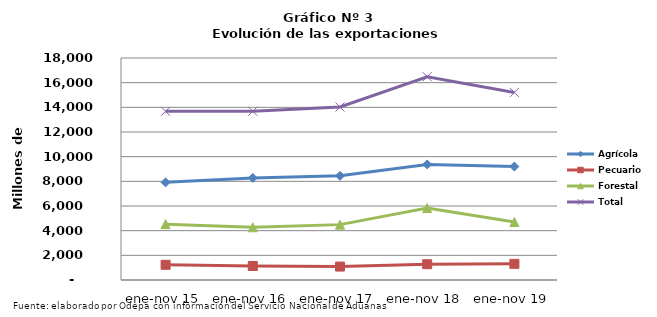
| Category | Agrícola | Pecuario | Forestal | Total |
|---|---|---|---|---|
| ene-nov 15 | 7916350 | 1233633 | 4528541 | 13678524 |
| ene-nov 16 | 8274279 | 1135833 | 4274966 | 13685078 |
| ene-nov 17 | 8448657 | 1088304 | 4489789 | 14026750 |
| ene-nov 18 | 9370749 | 1280199 | 5831677 | 16482625 |
| ene-nov 19 | 9196792 | 1309724 | 4701942 | 15208458 |